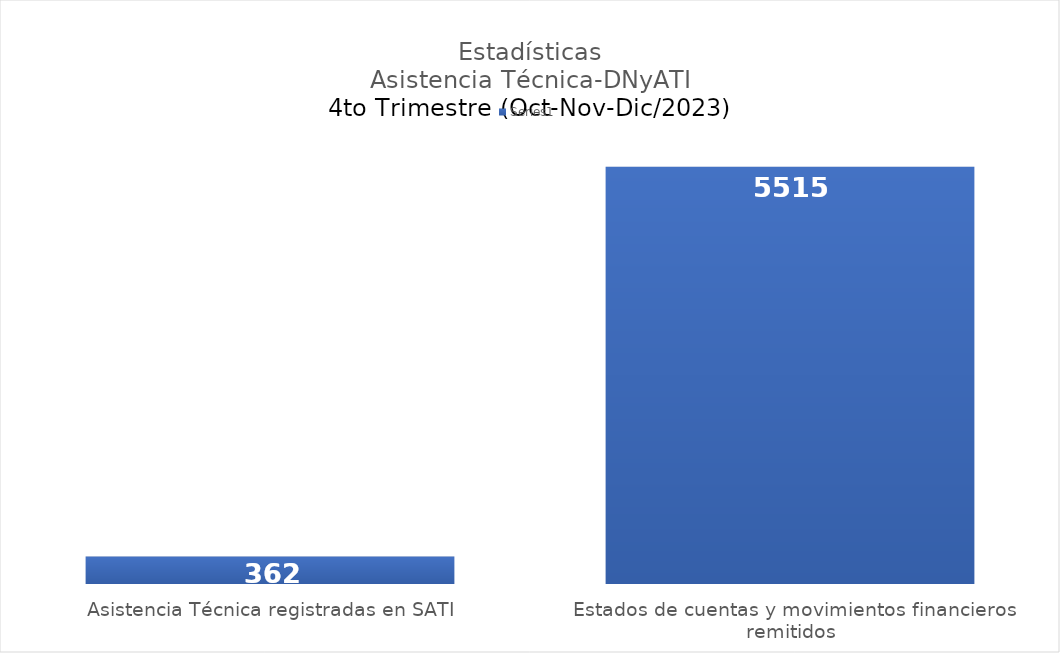
| Category | Series 0 |
|---|---|
| Asistencia Técnica registradas en SATI | 362 |
| Estados de cuentas y movimientos financieros remitidos | 5515 |